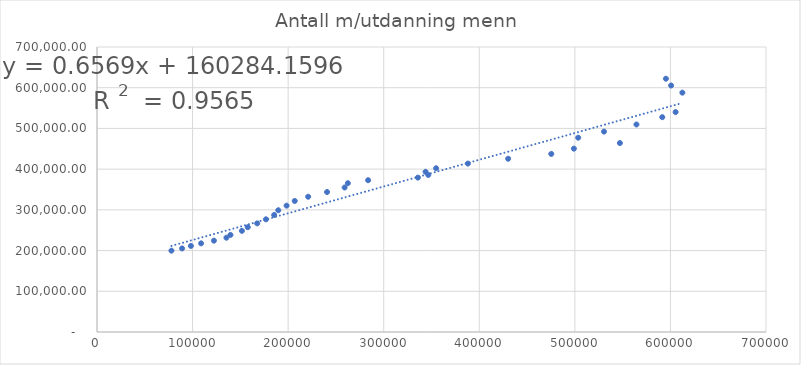
| Category | Antall m/utdanning menn  |
|---|---|
| 77895.0 | 199807 |
| 89028.0 | 205252 |
| 98256.0 | 211401 |
| 108929.0 | 217759 |
| 122340.0 | 224319 |
| 135421.0 | 231634 |
| 139648.0 | 238428 |
| 151634.0 | 248434 |
| 157759.0 | 257400 |
| 167649.0 | 266796 |
| 176792.0 | 276804 |
| 185391.0 | 287441 |
| 189691.0 | 299050 |
| 198377.0 | 310353 |
| 206900.0 | 321866 |
| 220941.0 | 332211 |
| 240716.0 | 343776 |
| 259088.0 | 354872 |
| 262485.0 | 365473 |
| 283668.0 | 372793 |
| 335760.0 | 379157 |
| 346626.0 | 385782 |
| 343792.0 | 393475 |
| 354801.0 | 402211 |
| 388070.0 | 413658 |
| 430201.0 | 425540 |
| 475320.0 | 437401 |
| 498999.0 | 450365 |
| 547125.0 | 464091 |
| 503487.0 | 477238 |
| 530498.0 | 492242 |
| 564447.0 | 509707 |
| 591455.0 | 527735 |
| 605408.0 | 540170 |
| 612498.0 | 587864 |
| 600728.0 | 605440 |
| 595291.0 | 622073 |